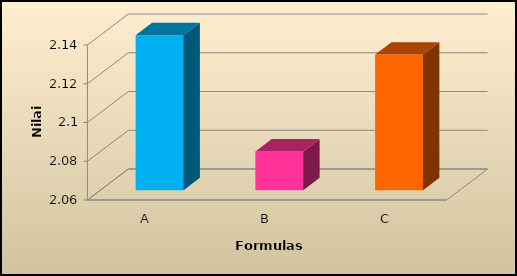
| Category | Rata-rata |
|---|---|
| A | 2.14 |
| B | 2.08 |
| C | 2.13 |